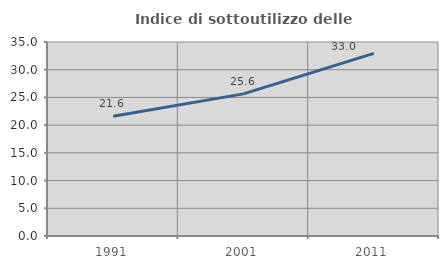
| Category | Indice di sottoutilizzo delle abitazioni  |
|---|---|
| 1991.0 | 21.61 |
| 2001.0 | 25.644 |
| 2011.0 | 32.96 |